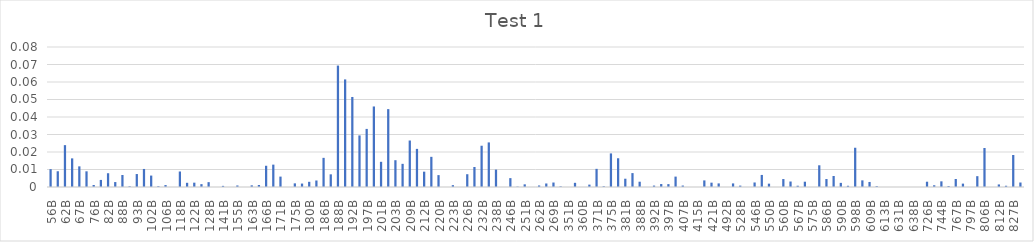
| Category | Series 0 |
|---|---|
| 56B | 0.01 |
| 59B | 0.009 |
| 62B | 0.024 |
| 65B | 0.016 |
| 67B | 0.012 |
| 72B | 0.009 |
| 76B | 0.001 |
| 79B | 0.004 |
| 82B | 0.008 |
| 85B | 0.003 |
| 88B | 0.007 |
| 91B | 0 |
| 93B | 0.007 |
| 99B | 0.01 |
| 102B | 0.007 |
| 104B | 0 |
| 106B | 0.001 |
| 112B | 0 |
| 118B | 0.009 |
| 120B | 0.002 |
| 122B | 0.002 |
| 124B | 0.002 |
| 128B | 0.003 |
| 132B | 0 |
| 141B | 0.001 |
| 144B | 0 |
| 155B | 0.001 |
| 158B | 0 |
| 163B | 0.001 |
| 165B | 0.001 |
| 166B | 0.012 |
| 169B | 0.013 |
| 171B | 0.006 |
| 173B | 0 |
| 175B | 0.002 |
| 178B | 0.002 |
| 180B | 0.003 |
| 182B | 0.004 |
| 186B | 0.017 |
| 184B | 0.007 |
| 188B | 0.069 |
| 189B | 0.061 |
| 192B | 0.051 |
| 195B | 0.029 |
| 197B | 0.033 |
| 198B | 0.046 |
| 201B | 0.014 |
| 203B | 0.044 |
| 203B | 0.015 |
| 207B | 0.013 |
| 209B | 0.027 |
| 208B | 0.022 |
| 212B | 0.009 |
| 216B | 0.017 |
| 220B | 0.007 |
| 220B | 0 |
| 223B | 0.001 |
| 223B | 0 |
| 226B | 0.007 |
| 230B | 0.011 |
| 232B | 0.024 |
| 234B | 0.025 |
| 238B | 0.01 |
| 242B | 0 |
| 246B | 0.005 |
| 246B | 0 |
| 251B | 0.002 |
| 260B | 0 |
| 262B | 0.001 |
| 265B | 0.002 |
| 269B | 0.003 |
| 274B | 0 |
| 351B | 0 |
| 359B | 0.002 |
| 360B | 0 |
| 364B | 0.001 |
| 371B | 0.01 |
| 373B | 0 |
| 375B | 0.019 |
| 380B | 0.016 |
| 381B | 0.005 |
| 386B | 0.008 |
| 388B | 0.003 |
| 388B | 0 |
| 392B | 0.001 |
| 394B | 0.002 |
| 397B | 0.002 |
| 400B | 0.006 |
| 407B | 0.001 |
| 413B | 0 |
| 415B | 0 |
| 420B | 0.004 |
| 421B | 0.002 |
| 442B | 0.002 |
| 492B | 0 |
| 526B | 0.002 |
| 528B | 0.001 |
| 540B | 0 |
| 546B | 0.003 |
| 548B | 0.007 |
| 550B | 0.002 |
| 553B | 0 |
| 560B | 0.005 |
| 564B | 0.003 |
| 567B | 0.001 |
| 570B | 0.003 |
| 575B | 0 |
| 579B | 0.012 |
| 586B | 0.005 |
| 588B | 0.006 |
| 590B | 0.002 |
| 594B | 0.001 |
| 598B | 0.022 |
| 607B | 0.004 |
| 609B | 0.003 |
| 609B | 0 |
| 613B | 0 |
| 629B | 0 |
| 631B | 0 |
| 633B | 0 |
| 638B | 0 |
| 694B | 0 |
| 726B | 0.003 |
| 742B | 0.001 |
| 744B | 0.003 |
| 748B | 0.001 |
| 767B | 0.005 |
| 786B | 0.002 |
| 797B | 0 |
| 799B | 0.006 |
| 806B | 0.022 |
| 809B | 0 |
| 812B | 0.001 |
| 815B | 0.001 |
| 827B | 0.018 |
| 847B | 0.003 |